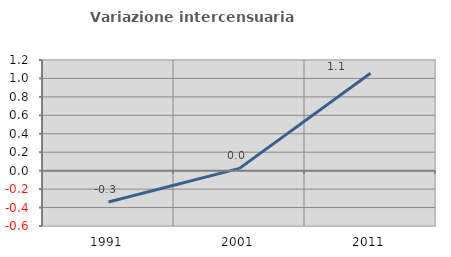
| Category | Variazione intercensuaria annua |
|---|---|
| 1991.0 | -0.34 |
| 2001.0 | 0.024 |
| 2011.0 | 1.057 |